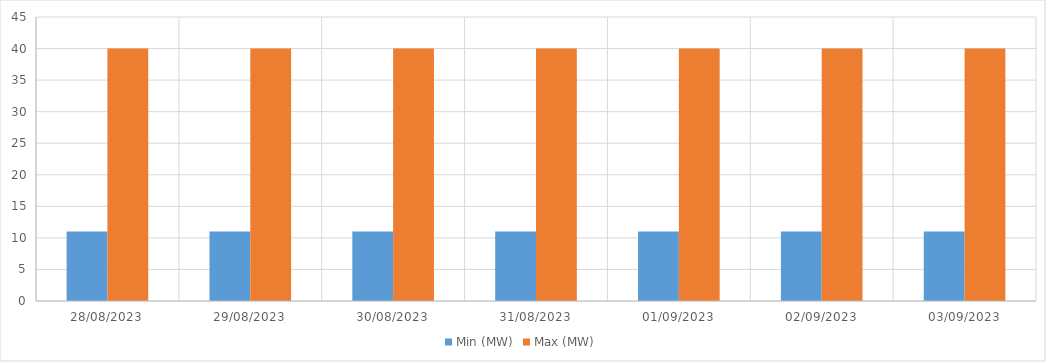
| Category | Min (MW) | Max (MW) |
|---|---|---|
| 28/08/2023 | 11 | 40 |
| 29/08/2023 | 11 | 40 |
| 30/08/2023 | 11 | 40 |
| 31/08/2023 | 11 | 40 |
| 01/09/2023 | 11 | 40 |
| 02/09/2023 | 11 | 40 |
| 03/09/2023 | 11 | 40 |